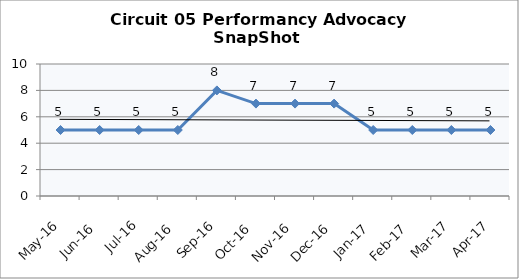
| Category | Circuit 05 |
|---|---|
| May-16 | 5 |
| Jun-16 | 5 |
| Jul-16 | 5 |
| Aug-16 | 5 |
| Sep-16 | 8 |
| Oct-16 | 7 |
| Nov-16 | 7 |
| Dec-16 | 7 |
| Jan-17 | 5 |
| Feb-17 | 5 |
| Mar-17 | 5 |
| Apr-17 | 5 |